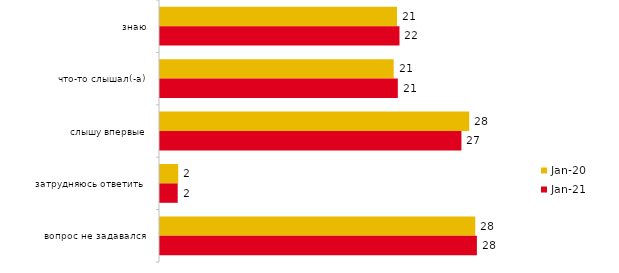
| Category | янв.20 | янв.21 |
|---|---|---|
| знаю | 21.287 | 21.51 |
| что-то слышал(-а) | 20.99 | 21.361 |
| слышу впервые | 27.772 | 27.074 |
| затрудняюсь ответить | 1.634 | 1.59 |
| вопрос не задавался | 28.317 | 28.465 |